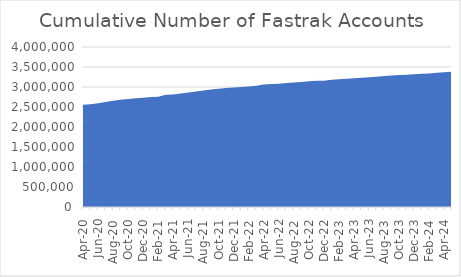
| Category | Number of Accounts |
|---|---|
| 2020-04-01 | 2557973 |
| 2020-05-01 | 2570728 |
| 2020-06-01 | 2594017 |
| 2020-07-01 | 2626965 |
| 2020-08-01 | 2656740 |
| 2020-09-01 | 2678456 |
| 2020-10-01 | 2699207 |
| 2020-11-01 | 2721686 |
| 2020-12-01 | 2730221 |
| 2021-01-01 | 2747361 |
| 2021-02-01 | 2759073 |
| 2021-03-01 | 2804236 |
| 2021-04-01 | 2811980 |
| 2021-05-01 | 2835594 |
| 2021-06-01 | 2859538 |
| 2021-07-01 | 2885735 |
| 2021-08-01 | 2914140 |
| 2021-09-01 | 2937690 |
| 2021-10-01 | 2956919 |
| 2021-11-01 | 2973420 |
| 2021-12-01 | 2986581 |
| 2022-01-01 | 3001634 |
| 2022-02-01 | 3015047 |
| 2022-03-01 | 3033972 |
| 2022-04-01 | 3059943 |
| 2022-05-01 | 3075592 |
| 2022-06-01 | 3079315 |
| 2022-07-01 | 3098377 |
| 2022-08-01 | 3115082 |
| 2022-09-01 | 3127768 |
| 2022-10-01 | 3144427 |
| 2022-11-01 | 3154888 |
| 2022-12-01 | 3155709 |
| 2023-01-01 | 3180298 |
| 2023-02-01 | 3193300 |
| 2023-03-01 | 3204734 |
| 2023-04-01 | 3217088 |
| 2023-05-01 | 3229286 |
| 2023-06-01 | 3243361 |
| 2023-07-01 | 3258404 |
| 2023-08-01 | 3275346 |
| 2023-09-01 | 3288823 |
| 2023-10-01 | 3298923 |
| 2023-11-01 | 3308042 |
| 2023-12-01 | 3316856 |
| 2024-01-01 | 3329822 |
| 2024-02-01 | 3340284 |
| 2024-03-01 | 3354284 |
| 2024-04-01 | 3371044 |
| 2024-05-01 | 3384220 |